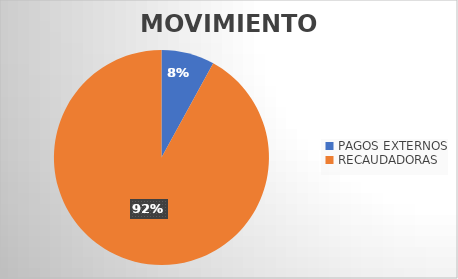
| Category | MOVIMIENTOS |
|---|---|
| PAGOS EXTERNOS | 7141 |
| RECAUDADORAS | 82203 |